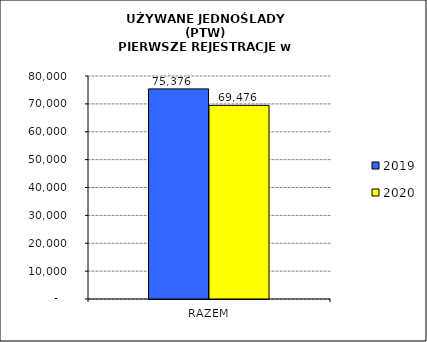
| Category | 2019 | 2020 |
|---|---|---|
| RAZEM | 75376 | 69476 |